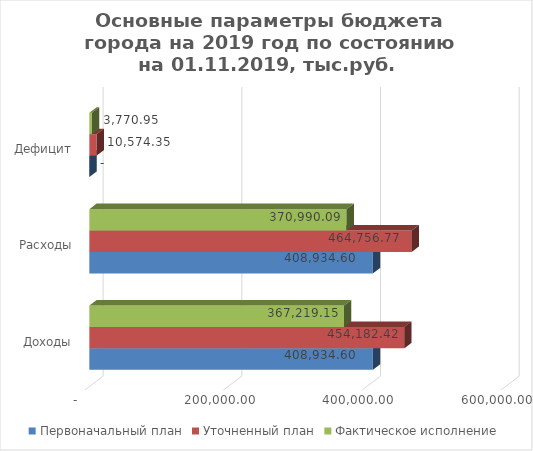
| Category | Первоначальный план | Уточненный план | Фактическое исполнение |
|---|---|---|---|
| Доходы | 408934.598 | 454182.423 | 367219.148 |
| Расходы | 408934.598 | 464756.771 | 370990.094 |
| Дефицит | 0 | 10574.348 | 3770.945 |